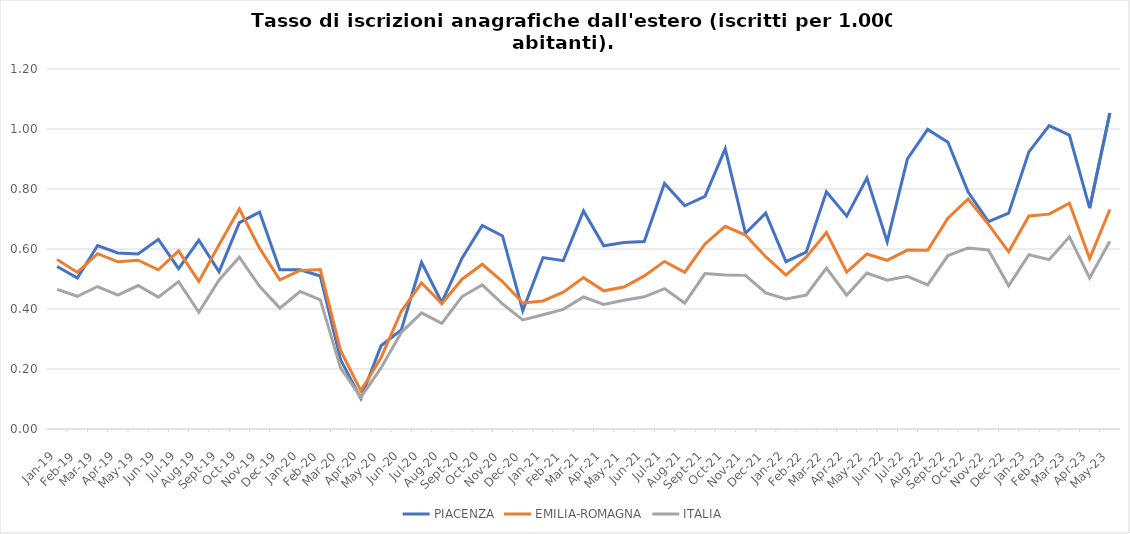
| Category | PIACENZA | EMILIA-ROMAGNA | ITALIA |
|---|---|---|---|
| 2019-01-01 | 0.542 | 0.565 | 0.465 |
| 2019-02-01 | 0.503 | 0.522 | 0.442 |
| 2019-03-01 | 0.612 | 0.584 | 0.475 |
| 2019-04-01 | 0.587 | 0.557 | 0.446 |
| 2019-05-01 | 0.584 | 0.563 | 0.478 |
| 2019-06-01 | 0.632 | 0.531 | 0.44 |
| 2019-07-01 | 0.535 | 0.594 | 0.491 |
| 2019-08-01 | 0.629 | 0.492 | 0.389 |
| 2019-09-01 | 0.524 | 0.614 | 0.497 |
| 2019-10-01 | 0.688 | 0.734 | 0.573 |
| 2019-11-01 | 0.723 | 0.603 | 0.476 |
| 2019-12-01 | 0.531 | 0.497 | 0.403 |
| 2020-01-01 | 0.531 | 0.528 | 0.458 |
| 2020-02-01 | 0.51 | 0.531 | 0.43 |
| 2020-03-01 | 0.231 | 0.262 | 0.204 |
| 2020-04-01 | 0.102 | 0.128 | 0.105 |
| 2020-05-01 | 0.278 | 0.238 | 0.204 |
| 2020-06-01 | 0.33 | 0.392 | 0.322 |
| 2020-07-01 | 0.555 | 0.487 | 0.387 |
| 2020-08-01 | 0.422 | 0.417 | 0.352 |
| 2020-09-01 | 0.569 | 0.499 | 0.441 |
| 2020-10-01 | 0.678 | 0.549 | 0.48 |
| 2020-11-01 | 0.643 | 0.492 | 0.417 |
| 2020-12-01 | 0.395 | 0.42 | 0.364 |
| 2021-01-01 | 0.571 | 0.427 | 0.381 |
| 2021-02-01 | 0.561 | 0.456 | 0.399 |
| 2021-03-01 | 0.727 | 0.504 | 0.44 |
| 2021-04-01 | 0.611 | 0.461 | 0.415 |
| 2021-05-01 | 0.621 | 0.473 | 0.429 |
| 2021-06-01 | 0.625 | 0.51 | 0.441 |
| 2021-07-01 | 0.819 | 0.559 | 0.468 |
| 2021-08-01 | 0.744 | 0.523 | 0.42 |
| 2021-09-01 | 0.776 | 0.617 | 0.518 |
| 2021-10-01 | 0.934 | 0.676 | 0.514 |
| 2021-11-01 | 0.652 | 0.647 | 0.512 |
| 2021-12-01 | 0.72 | 0.574 | 0.453 |
| 2022-01-01 | 0.558 | 0.513 | 0.434 |
| 2022-02-01 | 0.589 | 0.573 | 0.446 |
| 2022-03-01 | 0.791 | 0.655 | 0.537 |
| 2022-04-01 | 0.709 | 0.523 | 0.446 |
| 2022-05-01 | 0.836 | 0.583 | 0.52 |
| 2022-06-01 | 0.625 | 0.562 | 0.496 |
| 2022-07-01 | 0.9 | 0.596 | 0.509 |
| 2022-08-01 | 0.999 | 0.596 | 0.48 |
| 2022-09-01 | 0.956 | 0.703 | 0.578 |
| 2022-10-01 | 0.79 | 0.767 | 0.603 |
| 2022-11-01 | 0.691 | 0.682 | 0.597 |
| 2022-12-01 | 0.719 | 0.59 | 0.477 |
| 2023-01-01 | 0.924 | 0.71 | 0.581 |
| 2023-02-01 | 1.011 | 0.716 | 0.565 |
| 2023-03-01 | 0.979 | 0.753 | 0.64 |
| 2023-04-01 | 0.736 | 0.568 | 0.503 |
| 2023-05-01 | 1.053 | 0.732 | 0.626 |